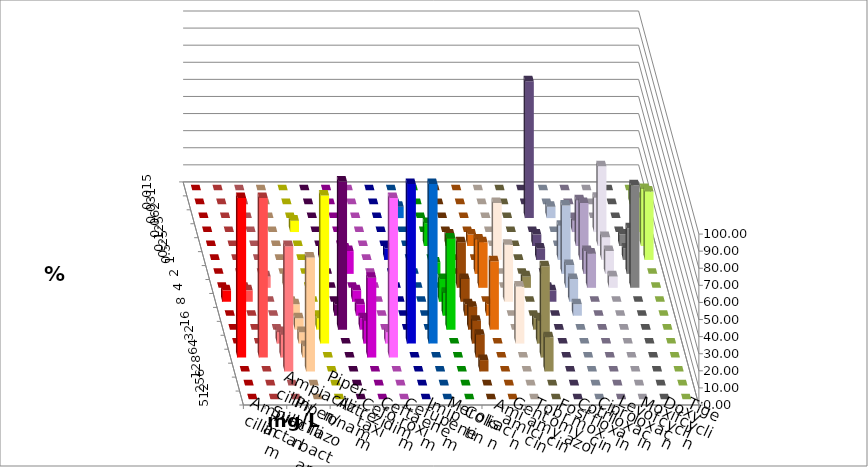
| Category | Ampicillin | Ampicillin/ Sulbactam | Piperacillin | Piperacillin/ Tazobactam | Aztreonam | Cefotaxim | Ceftazidim | Cefuroxim | Imipenem | Meropenem | Colistin | Amikacin | Gentamicin | Tobramycin | Fosfomycin | Cotrimoxazol | Ciprofloxacin | Levofloxacin | Moxifloxacin | Doxycyclin | Tigecyclin |
|---|---|---|---|---|---|---|---|---|---|---|---|---|---|---|---|---|---|---|---|---|---|
| 0.015 | 0 | 0 | 0 | 0 | 0 | 0 | 0 | 0 | 0 | 0 | 0 | 0 | 0 | 0 | 0 | 0 | 0 | 0 | 0 | 0 | 0 |
| 0.031 | 0 | 0 | 0 | 0 | 0 | 0 | 0 | 0 | 0 | 0 | 0 | 0 | 0 | 0 | 0 | 0 | 0 | 0 | 0 | 0 | 6.667 |
| 0.062 | 0 | 0 | 0 | 0 | 0 | 0 | 0 | 0 | 0 | 6.667 | 0 | 0 | 0 | 0 | 0 | 80 | 6.667 | 0 | 0 | 0 | 0 |
| 0.125 | 0 | 0 | 0 | 0 | 6.667 | 0 | 0 | 0 | 0 | 0 | 0 | 0 | 0 | 0 | 0 | 0 | 0 | 6.667 | 20 | 0 | 20 |
| 0.25 | 0 | 0 | 0 | 0 | 0 | 0 | 0 | 0 | 0 | 0 | 13.333 | 6.667 | 6.667 | 0 | 0 | 6.667 | 0 | 26.667 | 46.667 | 6.667 | 33.333 |
| 0.5 | 0 | 0 | 0 | 0 | 0 | 6.667 | 6.667 | 0 | 6.667 | 0 | 0 | 0 | 0 | 33.333 | 0 | 6.667 | 20 | 33.333 | 13.333 | 6.667 | 40 |
| 1.0 | 0 | 0 | 0 | 0 | 0 | 0 | 13.333 | 0 | 0 | 0 | 6.667 | 0 | 20 | 0 | 0 | 0 | 40 | 13.333 | 13.333 | 26.667 | 0 |
| 2.0 | 0 | 0 | 6.667 | 6.667 | 0 | 0 | 0 | 0 | 0 | 0 | 0 | 26.667 | 26.667 | 0 | 6.667 | 0 | 13.333 | 20 | 6.667 | 60 | 0 |
| 4.0 | 6.667 | 6.667 | 0 | 0 | 0 | 0 | 6.667 | 0 | 0 | 0 | 13.333 | 13.333 | 0 | 33.333 | 0 | 6.667 | 13.333 | 0 | 0 | 0 | 0 |
| 8.0 | 0 | 0 | 0 | 6.667 | 0 | 6.667 | 6.667 | 0 | 0 | 0 | 13.333 | 6.667 | 6.667 | 0 | 0 | 0 | 6.667 | 0 | 0 | 0 | 0 |
| 16.0 | 0 | 0 | 0 | 6.667 | 6.667 | 86.667 | 6.667 | 0 | 0 | 0 | 53.333 | 13.333 | 40 | 0 | 6.667 | 0 | 0 | 0 | 0 | 0 | 0 |
| 32.0 | 0 | 0 | 6.667 | 6.667 | 86.667 | 0 | 13.333 | 6.667 | 93.333 | 93.333 | 0 | 13.333 | 0 | 33.333 | 13.333 | 0 | 0 | 0 | 0 | 0 | 0 |
| 64.0 | 93.333 | 93.333 | 13.333 | 6.667 | 0 | 0 | 46.667 | 93.333 | 0 | 0 | 0 | 13.333 | 0 | 0 | 53.333 | 0 | 0 | 0 | 0 | 0 | 0 |
| 128.0 | 0 | 0 | 73.333 | 66.667 | 0 | 0 | 0 | 0 | 0 | 0 | 0 | 6.667 | 0 | 0 | 20 | 0 | 0 | 0 | 0 | 0 | 0 |
| 256.0 | 0 | 0 | 0 | 0 | 0 | 0 | 0 | 0 | 0 | 0 | 0 | 0 | 0 | 0 | 0 | 0 | 0 | 0 | 0 | 0 | 0 |
| 512.0 | 0 | 0 | 0 | 0 | 0 | 0 | 0 | 0 | 0 | 0 | 0 | 0 | 0 | 0 | 0 | 0 | 0 | 0 | 0 | 0 | 0 |